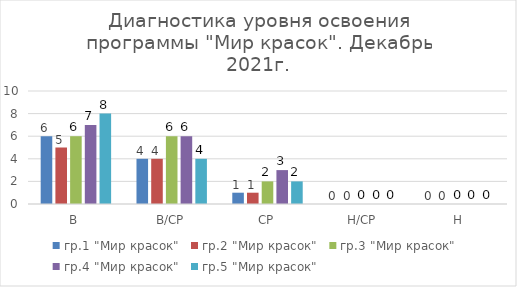
| Category | гр.1 "Мир красок" | гр.2 "Мир красок" | гр.3 "Мир красок" | гр.4 "Мир красок" | гр.5 "Мир красок"  |
|---|---|---|---|---|---|
| В | 6 | 5 | 6 | 7 | 8 |
| В/СР | 4 | 4 | 6 | 6 | 4 |
| СР | 1 | 1 | 2 | 3 | 2 |
| Н/СР | 0 | 0 | 0 | 0 | 0 |
| Н | 0 | 0 | 0 | 0 | 0 |